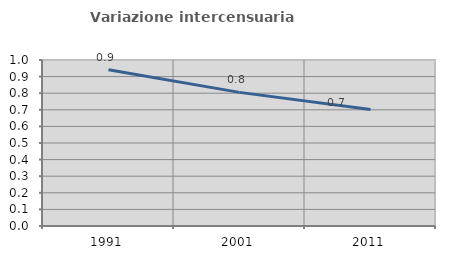
| Category | Variazione intercensuaria annua |
|---|---|
| 1991.0 | 0.942 |
| 2001.0 | 0.805 |
| 2011.0 | 0.702 |